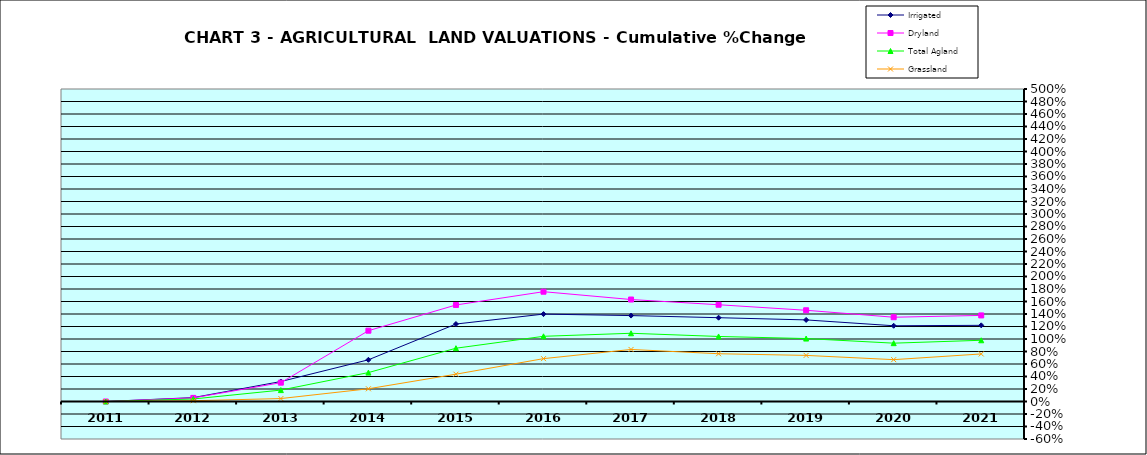
| Category | Irrigated | Dryland | Total Agland | Grassland |
|---|---|---|---|---|
| 2011.0 | 0 | 0 | 0 | 0 |
| 2012.0 | 0.062 | 0.058 | 0.04 | 0.013 |
| 2013.0 | 0.32 | 0.301 | 0.182 | 0.047 |
| 2014.0 | 0.667 | 1.133 | 0.463 | 0.204 |
| 2015.0 | 1.239 | 1.544 | 0.853 | 0.437 |
| 2016.0 | 1.398 | 1.757 | 1.043 | 0.686 |
| 2017.0 | 1.375 | 1.632 | 1.092 | 0.833 |
| 2018.0 | 1.341 | 1.548 | 1.041 | 0.764 |
| 2019.0 | 1.305 | 1.46 | 1.007 | 0.738 |
| 2020.0 | 1.212 | 1.348 | 0.933 | 0.67 |
| 2021.0 | 1.219 | 1.377 | 0.98 | 0.761 |